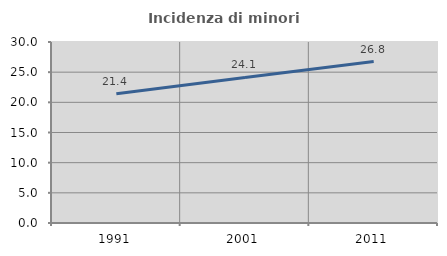
| Category | Incidenza di minori stranieri |
|---|---|
| 1991.0 | 21.429 |
| 2001.0 | 24.121 |
| 2011.0 | 26.761 |